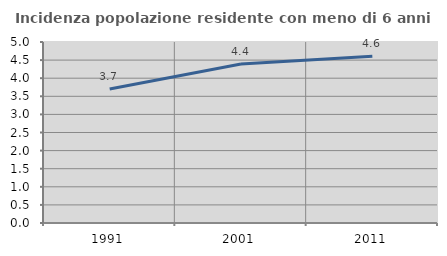
| Category | Incidenza popolazione residente con meno di 6 anni |
|---|---|
| 1991.0 | 3.703 |
| 2001.0 | 4.394 |
| 2011.0 | 4.607 |